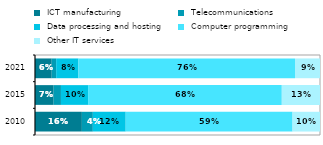
| Category |  ICT manufacturing |  Telecommunications |  Data processing and hosting |  Computer programming |  Other IT services  |
|---|---|---|---|---|---|
| 2010.0 | 0.164 | 0.038 | 0.115 | 0.585 | 0.096 |
| 2015.0 | 0.065 | 0.026 | 0.095 | 0.68 | 0.134 |
| 2021.0 | 0.059 | 0.016 | 0.078 | 0.76 | 0.088 |